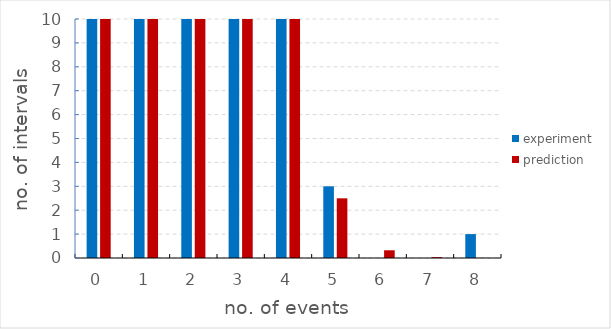
| Category | experiment | prediction |
|---|---|---|
| 0.0 | 1042 | 1060.611 |
| 1.0 | 860 | 823.744 |
| 2.0 | 307 | 319.888 |
| 3.0 | 78 | 82.816 |
| 4.0 | 15 | 16.08 |
| 5.0 | 3 | 2.498 |
| 6.0 | 0 | 0.323 |
| 7.0 | 0 | 0.036 |
| 8.0 | 1 | 0.003 |